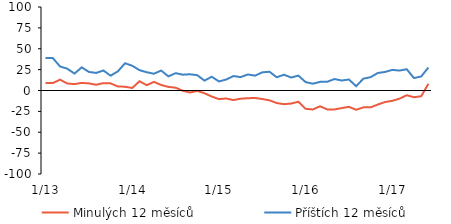
| Category | Minulých 12 měsíců | Příštích 12 měsíců |
|---|---|---|
|  1/13 | 8.92 | 38.82 |
|  2/13 | 8.92 | 38.82 |
|  3/13 | 12.98 | 28.75 |
|  4/13 | 8.4 | 26.12 |
|  5/13 | 7.64 | 20.26 |
|  6/13 | 9.1 | 27.71 |
|  7/13 | 8.51 | 22.2 |
|  8/13 | 6.89 | 21.06 |
|  9/13 | 8.81 | 23.95 |
|  10/13 | 8.54 | 17.76 |
|  11/13 | 4.88 | 22.87 |
|  12/13 | 4.53 | 32.62 |
|  1/14 | 2.99 | 29.64 |
|  2/14 | 11.1 | 24.37 |
|  3/14 | 6.35 | 21.86 |
|  4/14 | 10.34 | 20.09 |
|  5/14 | 6.57 | 23.91 |
|  6/14 | 4.33 | 16.91 |
|  7/14 | 3.35 | 20.75 |
|  8/14 | -0.33 | 18.95 |
|  9/14 | -2.37 | 19.44 |
|  10/14 | -0.5 | 18.32 |
|  11/14 | -3.3 | 11.85 |
|  12/14 | -7.21 | 16.46 |
|  1/15 | -10.32 | 10.88 |
|  2/15 | -9.55 | 13.1 |
|  3/15 | -11.45 | 17.32 |
|  4/15 | -9.85 | 16.04 |
|  5/15 | -9.22 | 19.19 |
|  6/15 | -8.99 | 17.77 |
|  7/15 | -10.2 | 21.74 |
|  8/15 | -11.76 | 22.49 |
|  9/15 | -15.03 | 15.86 |
|  10/15 | -16.38 | 18.89 |
|  11/15 | -15.64 | 15.55 |
|  12/15 | -13.49 | 17.84 |
|  1/16 | -21.91 | 10.03 |
|  2/16 | -22.72 | 8.16 |
|  3/16 | -18.91 | 10.34 |
|  4/16 | -22.65 | 10.48 |
|  5/16 | -22.69 | 13.73 |
|  6/16 | -21.05 | 11.99 |
|  7/16 | -19.56 | 13.15 |
|  8/16 | -23.1 | 5.15 |
|  9/16 | -20.21 | 14.17 |
|  10/16 | -20.19 | 16 |
|  11/16 | -16.81 | 20.99 |
|  12/16 | -13.84 | 22.19 |
|  1/17 | -12.4 | 24.7 |
|  2/17 | -9.79 | 23.87 |
|  3/17 | -5.67 | 25.48 |
|  4/17 | -8.04 | 14.94 |
|  5/17 | -6.9 | 16.78 |
|  6/17 | 7.95 | 27.5 |